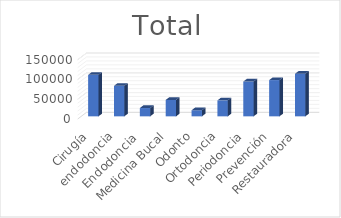
| Category | Total |
|---|---|
| Cirugía | 104900 |
| endodoncia | 77100 |
| Endodoncia  | 21000 |
| Medicina Bucal | 41500 |
| Odonto | 15400 |
| Ortodoncia | 40400 |
| Periodoncia | 88000 |
| Prevención | 91700 |
| Restauradora | 107700 |